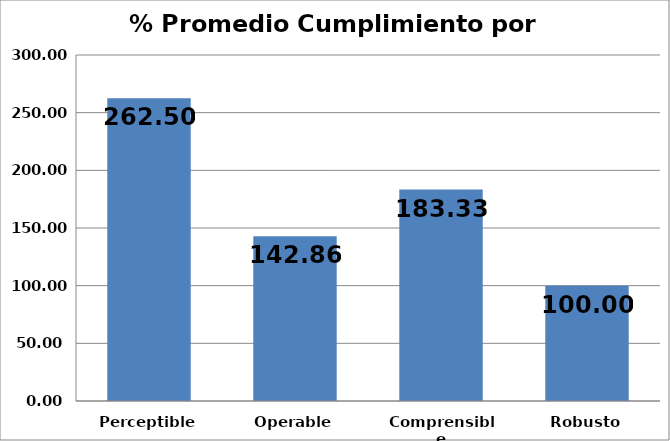
| Category | Series 0 |
|---|---|
| Perceptible | 262.5 |
| Operable | 142.857 |
| Comprensible | 183.333 |
| Robusto | 100 |